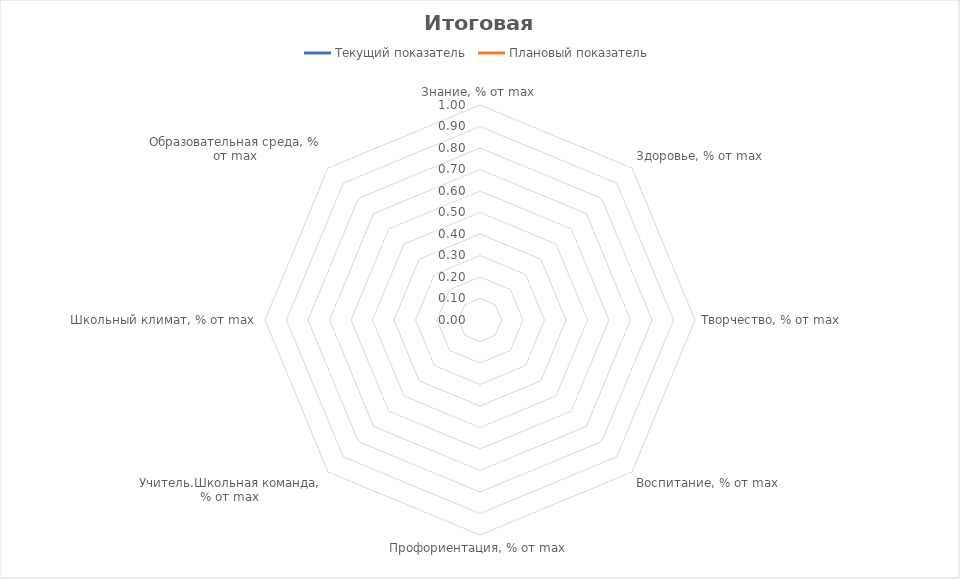
| Category | Текущий показатель | Плановый показатель |
|---|---|---|
| Знание, % от max | 0 | 0 |
| Здоровье, % от max | 0 | 0 |
| Творчество, % от max | 0 | 0 |
| Воспитание, % от max | 0 | 0 |
| Профориентация, % от max | 0 | 0 |
| Учитель.Школьная команда, % от max | 0 | 0 |
| Школьный климат, % от max | 0 | 0 |
| Образовательная среда, % от max | 0 | 0 |